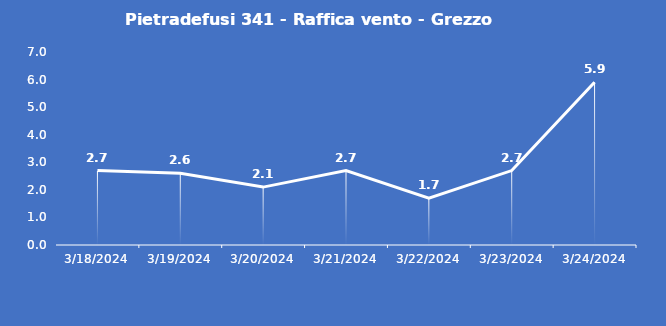
| Category | Pietradefusi 341 - Raffica vento - Grezzo (m/s) |
|---|---|
| 3/18/24 | 2.7 |
| 3/19/24 | 2.6 |
| 3/20/24 | 2.1 |
| 3/21/24 | 2.7 |
| 3/22/24 | 1.7 |
| 3/23/24 | 2.7 |
| 3/24/24 | 5.9 |